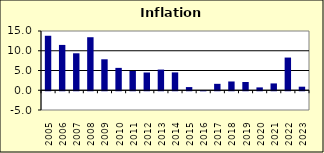
| Category | 9.4 |
|---|---|
| 2005.0 | 13.794 |
| 2006.0 | 11.476 |
| 2007.0 | 9.357 |
| 2008.0 | 13.424 |
| 2009.0 | 7.839 |
| 2010.0 | 5.663 |
| 2011.0 | 4.878 |
| 2012.0 | 4.496 |
| 2013.0 | 5.231 |
| 2014.0 | 4.519 |
| 2015.0 | 0.802 |
| 2016.0 | -0.017 |
| 2017.0 | 1.626 |
| 2018.0 | 2.221 |
| 2019.0 | 2.096 |
| 2020.0 | 0.725 |
| 2021.0 | 1.727 |
| 2022.0 | 8.275 |
| 2023.0 | 0.9 |